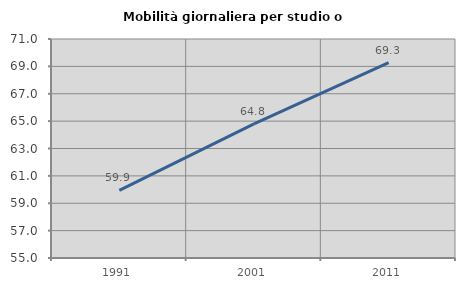
| Category | Mobilità giornaliera per studio o lavoro |
|---|---|
| 1991.0 | 59.946 |
| 2001.0 | 64.799 |
| 2011.0 | 69.272 |